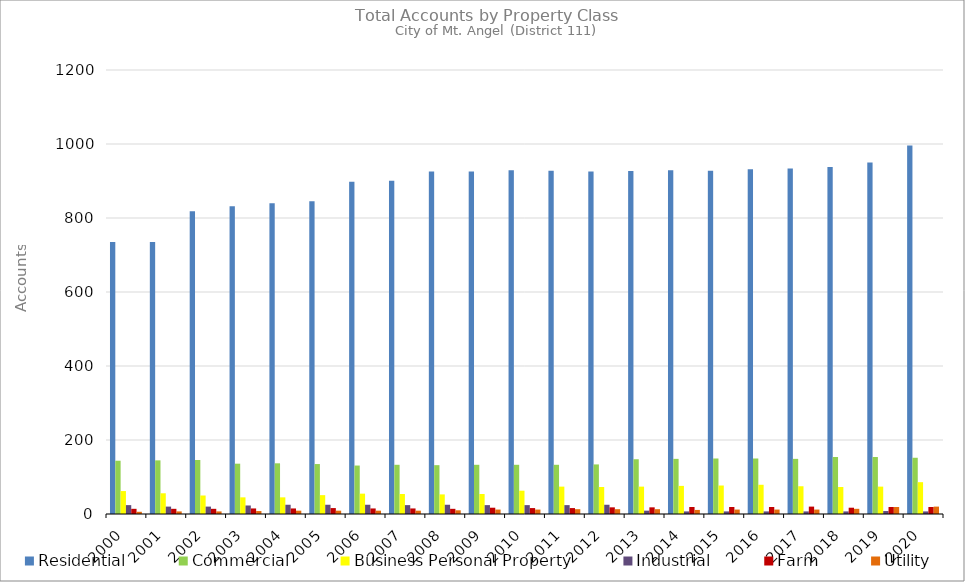
| Category | Residential | Commercial | Business Personal Property | Industrial | Farm | Utility |
|---|---|---|---|---|---|---|
| 2000.0 | 735 | 144 | 62 | 24 | 14 | 6 |
| 2001.0 | 735 | 145 | 56 | 20 | 14 | 7 |
| 2002.0 | 818 | 146 | 50 | 20 | 14 | 7 |
| 2003.0 | 832 | 136 | 45 | 23 | 15 | 8 |
| 2004.0 | 840 | 137 | 45 | 25 | 15 | 9 |
| 2005.0 | 845 | 135 | 51 | 25 | 16 | 9 |
| 2006.0 | 898 | 131 | 55 | 25 | 15 | 9 |
| 2007.0 | 901 | 133 | 54 | 24 | 15 | 9 |
| 2008.0 | 926 | 132 | 53 | 25 | 14 | 10 |
| 2009.0 | 926 | 133 | 54 | 24 | 17 | 12 |
| 2010.0 | 929 | 133 | 63 | 24 | 16 | 12 |
| 2011.0 | 928 | 133 | 74 | 24 | 16 | 13 |
| 2012.0 | 926 | 134 | 73 | 25 | 18 | 13 |
| 2013.0 | 927 | 148 | 74 | 9 | 18 | 13 |
| 2014.0 | 929 | 149 | 76 | 7 | 19 | 11 |
| 2015.0 | 928 | 150 | 77 | 7 | 19 | 12 |
| 2016.0 | 932 | 150 | 79 | 7 | 19 | 12 |
| 2017.0 | 934 | 149 | 75 | 7 | 20 | 12 |
| 2018.0 | 938 | 154 | 73 | 7 | 17 | 14 |
| 2019.0 | 950 | 154 | 74 | 8 | 19 | 19 |
| 2020.0 | 996 | 152 | 86 | 7 | 19 | 20 |